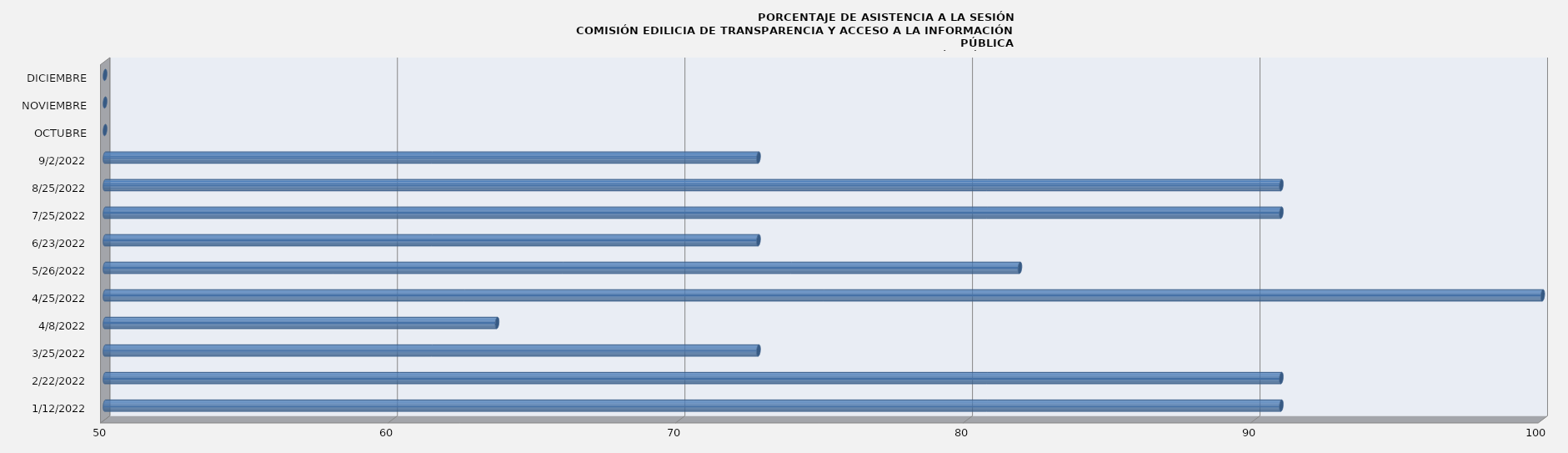
| Category | Series 0 |
|---|---|
| 12/01/2022 | 90.909 |
| 22/02/2022 | 90.909 |
| 25/03/2022 | 72.727 |
| 08/04/2022 | 63.636 |
| 25/04/2022 | 100 |
| 26/05/2022 | 81.818 |
| 23/06/2022 | 72.727 |
| 25/07/2022 | 90.909 |
| 25/08/2022 | 90.909 |
| 02/09/2022 | 72.727 |
| OCTUBRE | 0 |
| NOVIEMBRE | 0 |
| DICIEMBRE | 0 |